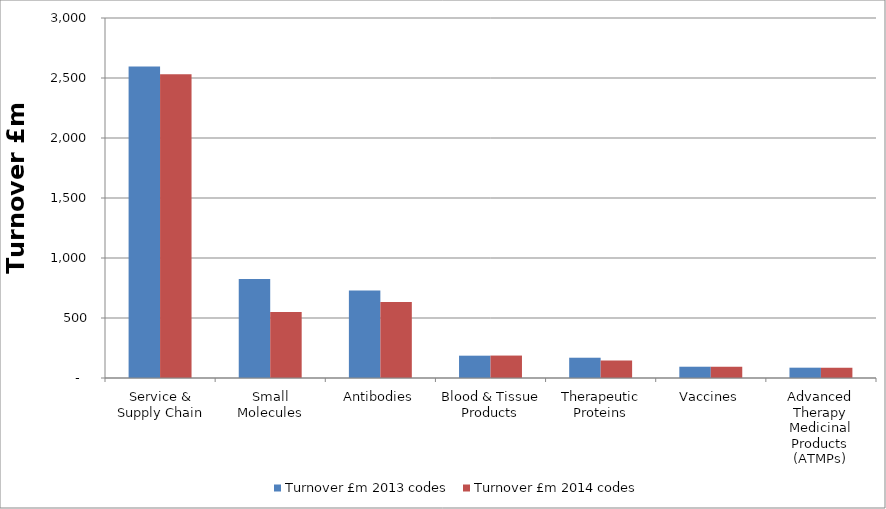
| Category | Turnover £m 2013 codes | Turnover £m 2014 codes |
|---|---|---|
| Service & Supply Chain | 2595 | 2532 |
| Small Molecules | 824 | 549 |
| Antibodies | 730 | 634 |
| Blood & Tissue Products | 186 | 187 |
| Therapeutic Proteins | 169 | 145 |
| Vaccines | 94 | 94 |
| Advanced Therapy Medicinal Products (ATMPs) | 86 | 86 |